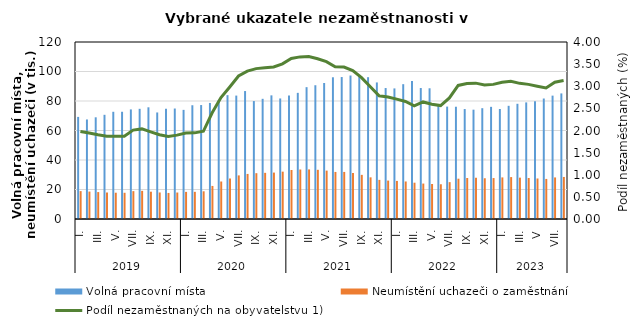
| Category | Volná pracovní místa | Neumístění uchazeči o zaměstnání |
|---|---|---|
| 0 | 69225 | 18908 |
| 1 | 67484 | 18592 |
| 2 | 68946 | 18254 |
| 3 | 70640 | 17913 |
| 4 | 72690 | 17821 |
| 5 | 72705 | 17771 |
| 6 | 74296 | 18895 |
| 7 | 74706 | 19089 |
| 8 | 75727 | 18515 |
| 9 | 72231 | 17985 |
| 10 | 74722 | 17666 |
| 11 | 74905 | 17955 |
| 12 | 73987 | 18390 |
| 13 | 77123 | 18423 |
| 14 | 77251 | 18788 |
| 15 | 78679 | 22421 |
| 16 | 80742 | 25424 |
| 17 | 83969 | 27405 |
| 18 | 83672 | 29567 |
| 19 | 86744 | 30556 |
| 20 | 79961 | 31056 |
| 21 | 81479 | 31302 |
| 22 | 83826 | 31473 |
| 23 | 81719 | 32107 |
| 24 | 83735 | 33217 |
| 25 | 85524 | 33565 |
| 26 | 89385 | 33612 |
| 27 | 90690 | 33352 |
| 28 | 92204 | 32808 |
| 29 | 96081 | 31905 |
| 30 | 96249 | 31917 |
| 31 | 97288 | 31271 |
| 32 | 97734 | 29926 |
| 33 | 96137 | 28242 |
| 34 | 92587 | 26521 |
| 35 | 88785 | 26047 |
| 36 | 88536 | 25817 |
| 37 | 91403 | 25444 |
| 38 | 93541 | 24612 |
| 39 | 88791 | 24028 |
| 40 | 88625 | 23728 |
| 41 | 77627 | 23550 |
| 42 | 76207 | 24989 |
| 43 | 76110 | 27326 |
| 44 | 74541 | 27809 |
| 45 | 74117 | 27914 |
| 46 | 75125 | 27625 |
| 47 | 76045 | 27766 |
| 48 | 74577 | 28199 |
| 49 | 76736 | 28419 |
| 50 | 78112 | 28041 |
| 51 | 79054 | 27810 |
| 52 | 79846 | 27469 |
| 53 | 81683 | 27164 |
| 54 | 83644 | 28176 |
| 55 | 85142 | 28501 |